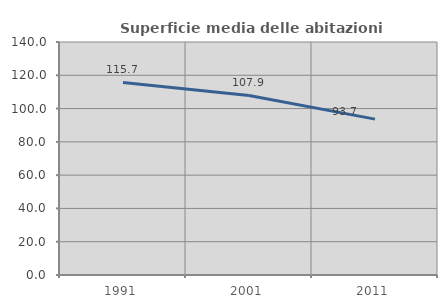
| Category | Superficie media delle abitazioni occupate |
|---|---|
| 1991.0 | 115.68 |
| 2001.0 | 107.912 |
| 2011.0 | 93.671 |